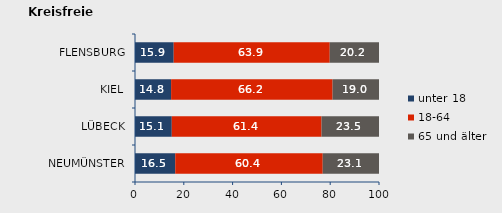
| Category | unter 18 | 18-64 | 65 und älter |
|---|---|---|---|
| NEUMÜNSTER | 16.493 | 60.447 | 23.06 |
| LÜBECK | 15.077 | 61.374 | 23.549 |
| KIEL | 14.799 | 66.183 | 19.018 |
| FLENSBURG | 15.866 | 63.947 | 20.187 |